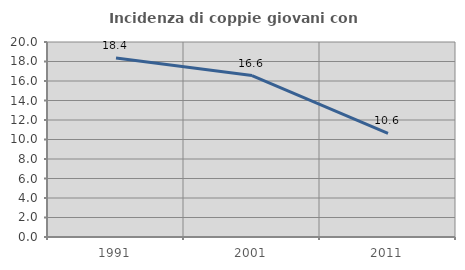
| Category | Incidenza di coppie giovani con figli |
|---|---|
| 1991.0 | 18.359 |
| 2001.0 | 16.553 |
| 2011.0 | 10.623 |